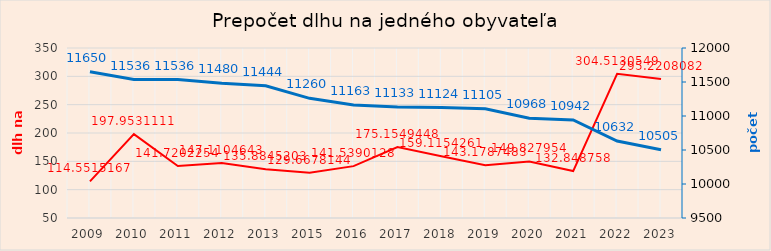
| Category | c/ prepočet výšky dlhu na občana |
|---|---|
| 2009.0 | 114.552 |
| 2010.0 | 197.953 |
| 2011.0 | 141.72 |
| 2012.0 | 147.11 |
| 2013.0 | 135.885 |
| 2015.0 | 129.668 |
| 2016.0 | 141.539 |
| 2017.0 | 175.155 |
| 2018.0 | 159.115 |
| 2019.0 | 143.179 |
| 2020.0 | 149.828 |
| 2021.0 | 132.849 |
| 2022.0 | 304.513 |
| 2023.0 | 295.221 |